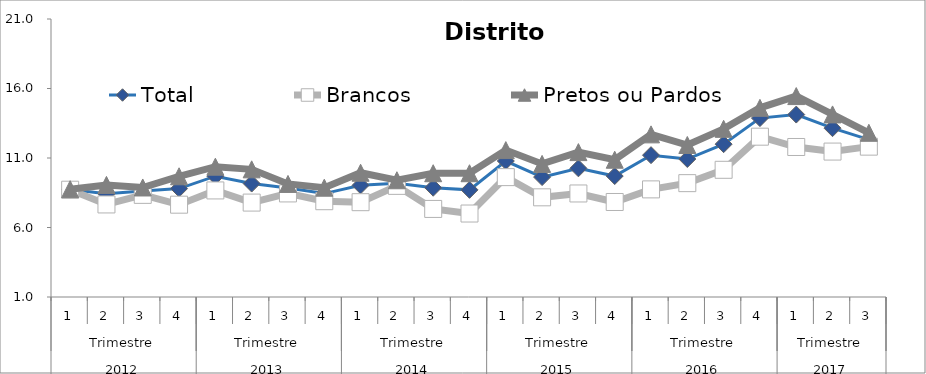
| Category | Total | Brancos | Pretos ou Pardos |
|---|---|---|---|
| 0 | 8.728 | 8.719 | 8.757 |
| 1 | 8.43 | 7.659 | 9.064 |
| 2 | 8.628 | 8.347 | 8.88 |
| 3 | 8.799 | 7.642 | 9.685 |
| 4 | 9.691 | 8.667 | 10.374 |
| 5 | 9.161 | 7.792 | 10.185 |
| 6 | 8.846 | 8.451 | 9.134 |
| 7 | 8.439 | 7.892 | 8.863 |
| 8 | 9.032 | 7.822 | 9.939 |
| 9 | 9.191 | 8.995 | 9.399 |
| 10 | 8.861 | 7.336 | 9.905 |
| 11 | 8.708 | 7.006 | 9.904 |
| 12 | 10.784 | 9.625 | 11.569 |
| 13 | 9.627 | 8.171 | 10.575 |
| 14 | 10.258 | 8.447 | 11.423 |
| 15 | 9.701 | 7.835 | 10.876 |
| 16 | 11.203 | 8.742 | 12.701 |
| 17 | 10.926 | 9.191 | 11.936 |
| 18 | 11.996 | 10.151 | 13.098 |
| 19 | 13.871 | 12.534 | 14.609 |
| 20 | 14.125 | 11.791 | 15.455 |
| 21 | 13.146 | 11.463 | 14.135 |
| 22 | 12.326 | 11.817 | 12.813 |